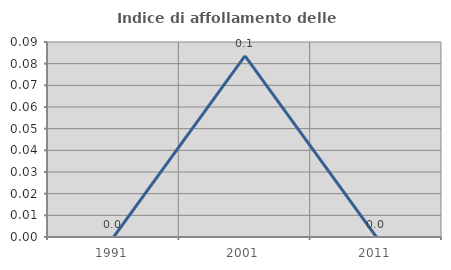
| Category | Indice di affollamento delle abitazioni  |
|---|---|
| 1991.0 | 0 |
| 2001.0 | 0.084 |
| 2011.0 | 0 |